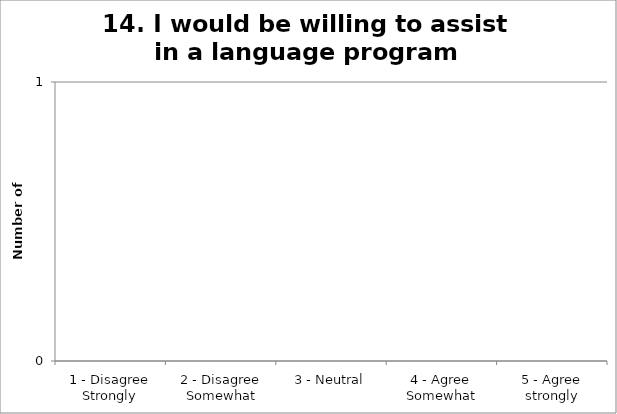
| Category | 14. I would be willing to assist in a language program |
|---|---|
| 1 - Disagree Strongly | 0 |
| 2 - Disagree Somewhat | 0 |
| 3 - Neutral | 0 |
| 4 - Agree Somewhat | 0 |
| 5 - Agree strongly | 0 |